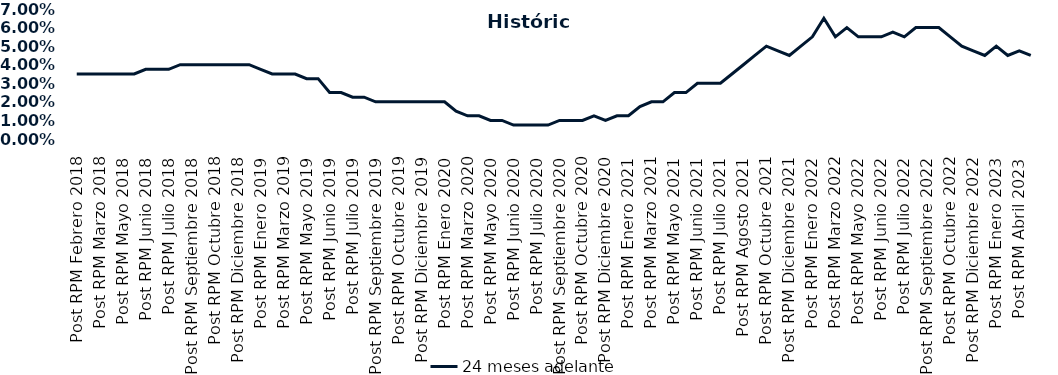
| Category | 24 meses adelante  |
|---|---|
| Post RPM Febrero 2018 | 0.035 |
| Pre RPM Marzo 2018 | 0.035 |
| Post RPM Marzo 2018 | 0.035 |
| Pre RPM Mayo 2018 | 0.035 |
| Post RPM Mayo 2018 | 0.035 |
| Pre RPM Junio 2018 | 0.035 |
| Post RPM Junio 2018 | 0.038 |
| Pre RPM Julio 2018 | 0.038 |
| Post RPM Julio 2018 | 0.038 |
| Pre RPM Septiembre 2018 | 0.04 |
| Post RPM Septiembre 2018 | 0.04 |
| Pre RPM Octubre 2018 | 0.04 |
| Post RPM Octubre 2018 | 0.04 |
| Pre RPM Diciembre 2018 | 0.04 |
| Post RPM Diciembre 2018 | 0.04 |
| Pre RPM Enero 2019 | 0.04 |
| Post RPM Enero 2019 | 0.038 |
| Pre RPM Marzo 2019 | 0.035 |
| Post RPM Marzo 2019 | 0.035 |
| Pre RPM Mayo 2019 | 0.035 |
| Post RPM Mayo 2019 | 0.032 |
| Pre RPM Junio 2019 | 0.032 |
| Post RPM Junio 2019 | 0.025 |
| Pre RPM Julio 2019 | 0.025 |
| Post RPM Julio 2019 | 0.022 |
| Pre RPM Septiembre 2019 | 0.022 |
| Post RPM Septiembre 2019 | 0.02 |
| Pre RPM Octubre 2019 | 0.02 |
| Post RPM Octubre 2019 | 0.02 |
| Pre RPM Diciembre 2019 | 0.02 |
| Post RPM Diciembre 2019 | 0.02 |
| Pre RPM Enero 2020 | 0.02 |
| Post RPM Enero 2020 | 0.02 |
| Pre RPM Marzo 2020 | 0.015 |
| Post RPM Marzo 2020 | 0.012 |
| Pre RPM Mayo 2020 | 0.012 |
| Post RPM Mayo 2020 | 0.01 |
| Pre RPM Junio 2020 | 0.01 |
| Post RPM Junio 2020 | 0.008 |
| Pre RPM Julio 2020 | 0.008 |
| Post RPM Julio 2020 | 0.008 |
| Pre RPM Septiembre 2020 | 0.008 |
| Post RPM Septiembre 2020 | 0.01 |
| Pre RPM Octubre 2020 | 0.01 |
| Post RPM Octubre 2020 | 0.01 |
| Pre RPM Diciembre 2020 | 0.012 |
| Post RPM Diciembre 2020 | 0.01 |
| Pre RPM Enero 2021 | 0.012 |
| Post RPM Enero 2021 | 0.012 |
| Pre RPM Marzo 2021 | 0.018 |
| Post RPM Marzo 2021 | 0.02 |
| Pre RPM Mayo 2021 | 0.02 |
| Post RPM Mayo 2021 | 0.025 |
| Pre RPM Junio 2021 | 0.025 |
| Post RPM Junio 2021 | 0.03 |
| Pre RPM Julio 2021 | 0.03 |
| Post RPM Julio 2021 | 0.03 |
| Pre RPM Agosto 2021 | 0.035 |
| Post RPM Agosto 2021 | 0.04 |
| Pre RPM Octubre 2021 | 0.045 |
| Post RPM Octubre 2021 | 0.05 |
| Pre RPM Diciembre 2021 | 0.048 |
| Post RPM Diciembre 2021 | 0.045 |
| Pre RPM Enero 2022 | 0.05 |
| Post RPM Enero 2022 | 0.055 |
| Pre RPM Marzo 2022 | 0.065 |
| Post RPM Marzo 2022 | 0.055 |
| Pre RPM Mayo 2022 | 0.06 |
| Post RPM Mayo 2022 | 0.055 |
| Pre RPM Junio 2022 | 0.055 |
| Post RPM Junio 2022 | 0.055 |
| Pre RPM Julio 2022 | 0.058 |
| Post RPM Julio 2022 | 0.055 |
| Pre RPM Septiembre 2022 | 0.06 |
| Post RPM Septiembre 2022 | 0.06 |
| Pre RPM Octubre 2022 | 0.06 |
| Post RPM Octubre 2022 | 0.055 |
| Pre RPM Diciembre 2022 | 0.05 |
| Post RPM Diciembre 2022 | 0.048 |
| Pre RPM Enero 2023 | 0.045 |
| Post RPM Enero 2023 | 0.05 |
| Pre RPM Abril 2023 | 0.045 |
| Post RPM Abril 2023 | 0.048 |
| Pre RPM Mayo 2023 | 0.045 |